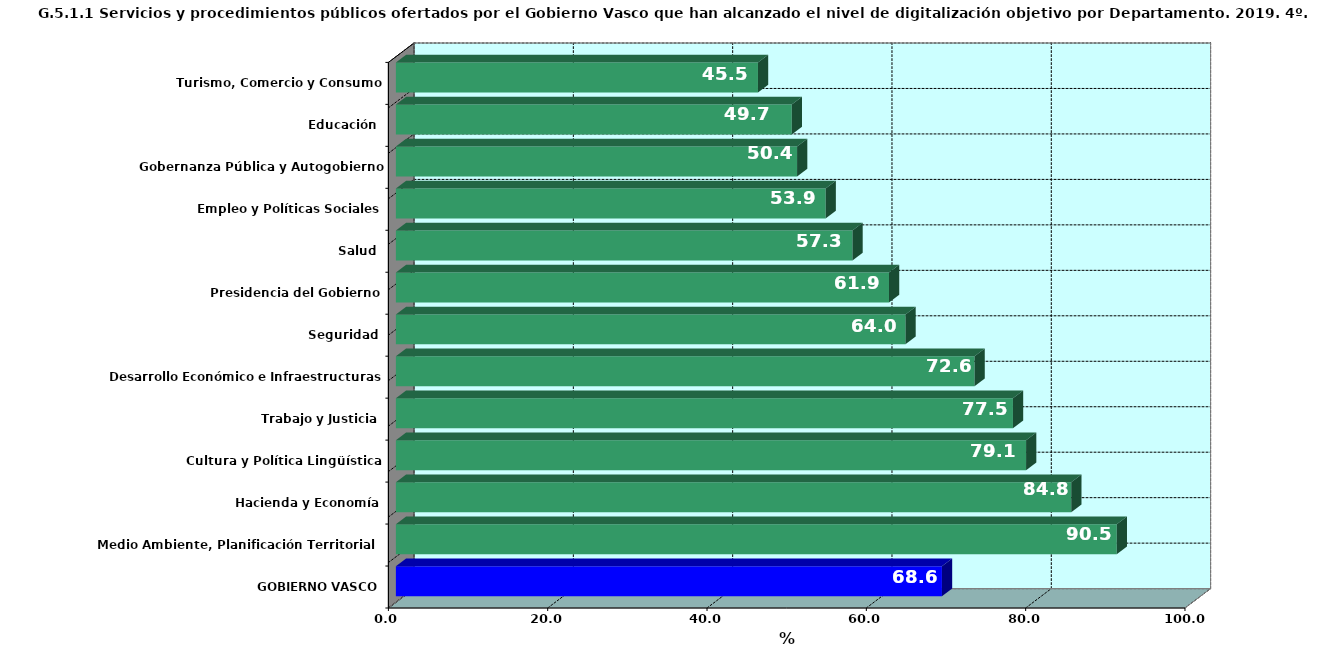
| Category | DIGITALIZACIÓN OBJETIVO 4T-2019 |
|---|---|
| GOBIERNO VASCO | 68.55 |
| Medio Ambiente, Planificación Territorial y Vivienda | 90.496 |
| Hacienda y Economía | 84.783 |
| Cultura y Política Lingüística | 79.114 |
| Trabajo y Justicia | 77.465 |
| Desarrollo Económico e Infraestructuras | 72.642 |
| Seguridad | 63.971 |
| Presidencia del Gobierno | 61.905 |
| Salud | 57.317 |
| Empleo y Políticas Sociales | 53.947 |
| Gobernanza Pública y Autogobierno | 50.365 |
| Educación | 49.697 |
| Turismo, Comercio y Consumo | 45.455 |